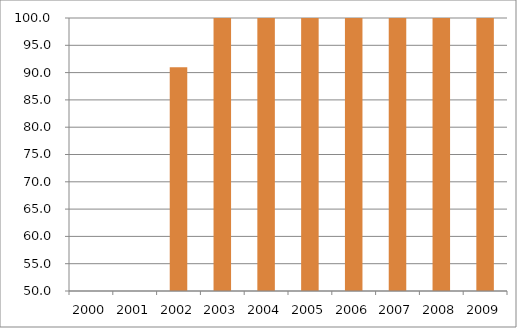
| Category | Região Nordeste |
|---|---|
| 2000.0 | 0 |
| 2001.0 | 0 |
| 2002.0 | 90.96 |
| 2003.0 | 111.75 |
| 2004.0 | 107.73 |
| 2005.0 | 100.68 |
| 2006.0 | 104.8 |
| 2007.0 | 109.35 |
| 2008.0 | 104.47 |
| 2009.0 | 105.42 |